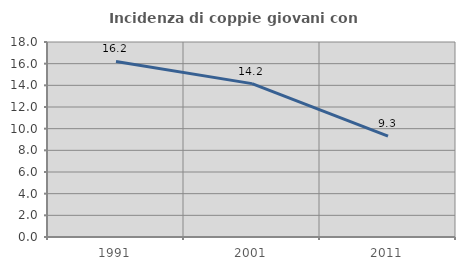
| Category | Incidenza di coppie giovani con figli |
|---|---|
| 1991.0 | 16.203 |
| 2001.0 | 14.157 |
| 2011.0 | 9.305 |